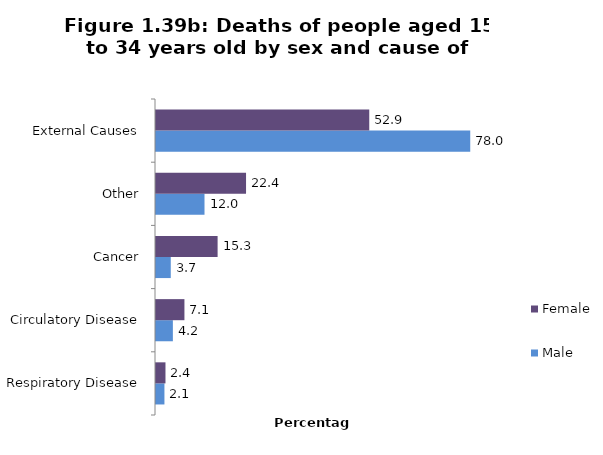
| Category | Male | Female |
|---|---|---|
| Respiratory Disease | 2.094 | 2.353 |
| Circulatory Disease | 4.188 | 7.059 |
| Cancer | 3.665 | 15.294 |
| Other | 12.042 | 22.353 |
| External Causes | 78.01 | 52.941 |